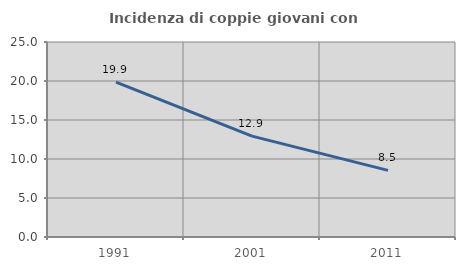
| Category | Incidenza di coppie giovani con figli |
|---|---|
| 1991.0 | 19.868 |
| 2001.0 | 12.929 |
| 2011.0 | 8.546 |